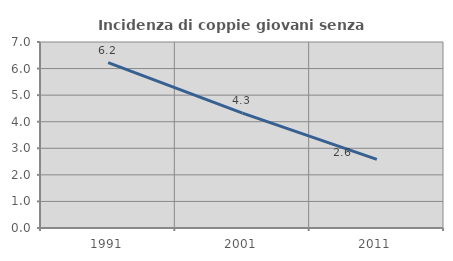
| Category | Incidenza di coppie giovani senza figli |
|---|---|
| 1991.0 | 6.224 |
| 2001.0 | 4.324 |
| 2011.0 | 2.58 |